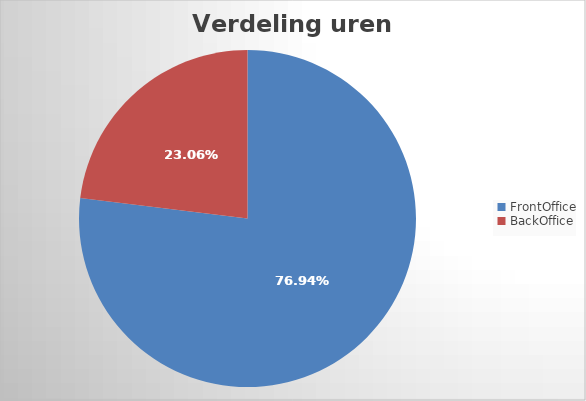
| Category | Verdeling uren Front/Backoffice |
|---|---|
| FrontOffice | 0.769 |
| BackOffice | 0.231 |